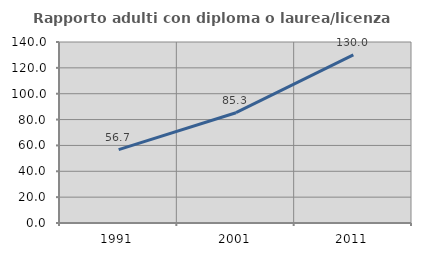
| Category | Rapporto adulti con diploma o laurea/licenza media  |
|---|---|
| 1991.0 | 56.708 |
| 2001.0 | 85.317 |
| 2011.0 | 130.01 |